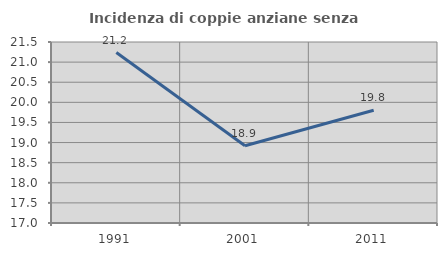
| Category | Incidenza di coppie anziane senza figli  |
|---|---|
| 1991.0 | 21.239 |
| 2001.0 | 18.919 |
| 2011.0 | 19.802 |